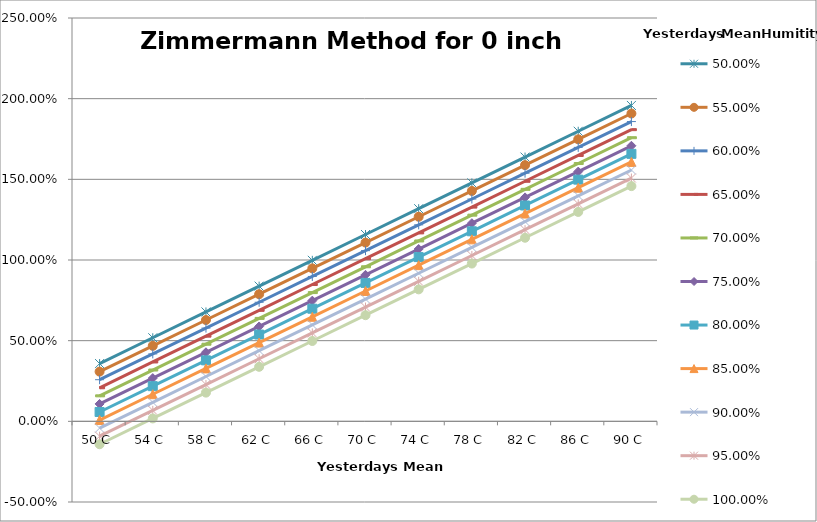
| Category | 50,00% | 55,00% | 60,00% | 65,00% | 70,00% | 75,00% | 80,00% | 85,00% | 90,00% | 95,00% | 100,00% |
|---|---|---|---|---|---|---|---|---|---|---|---|
| 50.0 | 0.358 | 0.308 | 0.258 | 0.208 | 0.158 | 0.108 | 0.058 | 0.008 | -0.042 | -0.092 | -0.142 |
| 54.0 | 0.518 | 0.468 | 0.418 | 0.368 | 0.318 | 0.268 | 0.218 | 0.168 | 0.118 | 0.068 | 0.018 |
| 58.0 | 0.678 | 0.628 | 0.578 | 0.528 | 0.478 | 0.428 | 0.378 | 0.328 | 0.278 | 0.228 | 0.178 |
| 62.0 | 0.838 | 0.788 | 0.738 | 0.688 | 0.638 | 0.588 | 0.538 | 0.488 | 0.438 | 0.388 | 0.338 |
| 66.0 | 0.998 | 0.948 | 0.898 | 0.848 | 0.798 | 0.748 | 0.698 | 0.648 | 0.598 | 0.548 | 0.498 |
| 70.0 | 1.158 | 1.108 | 1.058 | 1.008 | 0.958 | 0.908 | 0.858 | 0.808 | 0.758 | 0.708 | 0.658 |
| 74.0 | 1.318 | 1.268 | 1.218 | 1.168 | 1.118 | 1.068 | 1.018 | 0.968 | 0.918 | 0.868 | 0.818 |
| 78.0 | 1.478 | 1.428 | 1.378 | 1.328 | 1.278 | 1.228 | 1.178 | 1.128 | 1.078 | 1.028 | 0.978 |
| 82.0 | 1.638 | 1.588 | 1.538 | 1.488 | 1.438 | 1.388 | 1.338 | 1.288 | 1.238 | 1.188 | 1.138 |
| 86.0 | 1.798 | 1.748 | 1.698 | 1.648 | 1.598 | 1.548 | 1.498 | 1.448 | 1.398 | 1.348 | 1.298 |
| 90.0 | 1.958 | 1.908 | 1.858 | 1.808 | 1.758 | 1.708 | 1.658 | 1.608 | 1.558 | 1.508 | 1.458 |